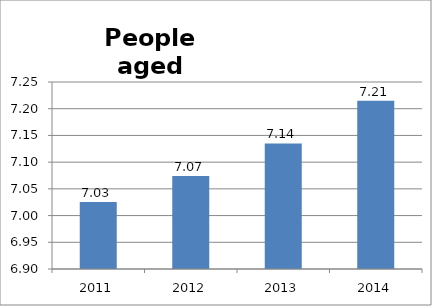
| Category | Series 0 |
|---|---|
| 2011 | 7.025 |
| 2012 | 7.074 |
| 2013 | 7.135 |
| 2014 | 7.215 |